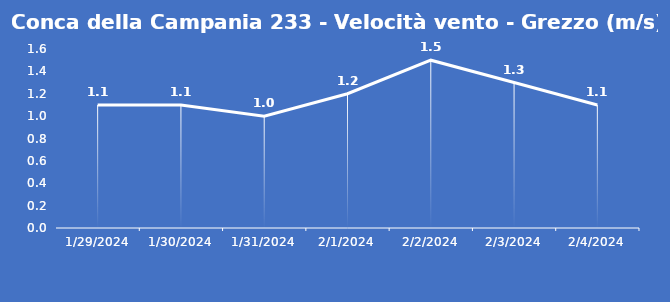
| Category | Conca della Campania 233 - Velocità vento - Grezzo (m/s) |
|---|---|
| 1/29/24 | 1.1 |
| 1/30/24 | 1.1 |
| 1/31/24 | 1 |
| 2/1/24 | 1.2 |
| 2/2/24 | 1.5 |
| 2/3/24 | 1.3 |
| 2/4/24 | 1.1 |